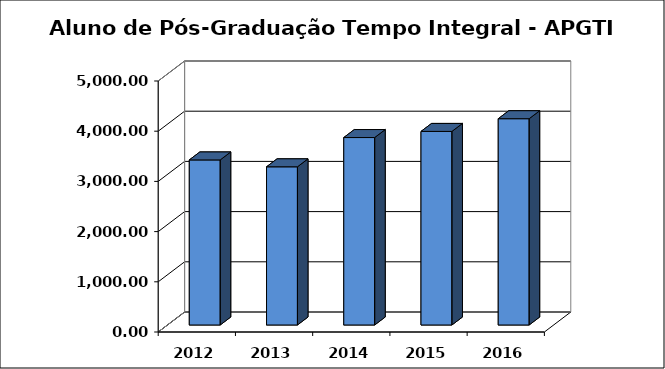
| Category | Series 0 |
|---|---|
| 2012.0 | 3288 |
| 2013.0 | 3151 |
| 2014.0 | 3734 |
| 2015.0 | 3855.833 |
| 2016.0 | 4108.98 |